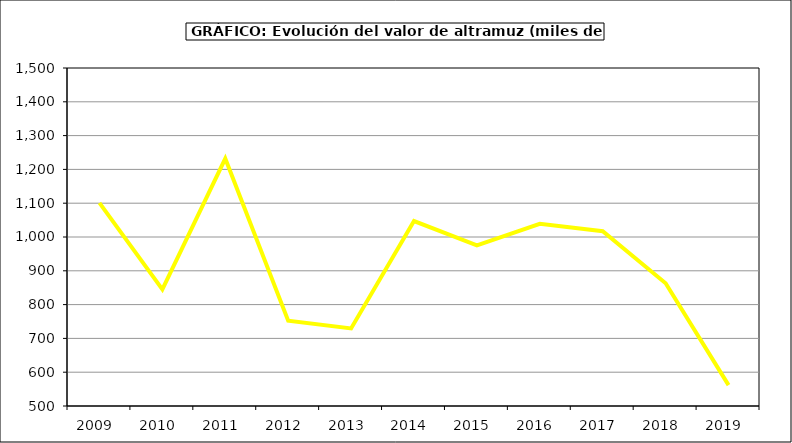
| Category | Valor |
|---|---|
| 2009.0 | 1100.989 |
| 2010.0 | 845.15 |
| 2011.0 | 1232.091 |
| 2012.0 | 752.557 |
| 2013.0 | 729.577 |
| 2014.0 | 1047.124 |
| 2015.0 | 975 |
| 2016.0 | 1039 |
| 2017.0 | 1016.9 |
| 2018.0 | 863.103 |
| 2019.0 | 561.855 |